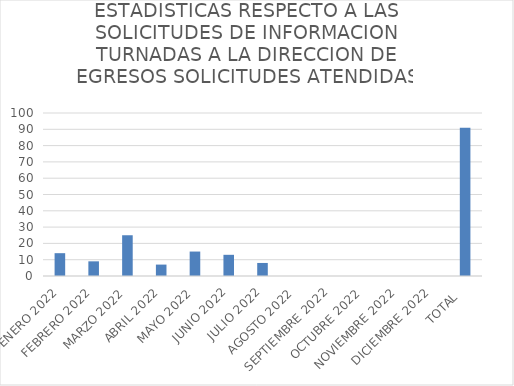
| Category | ESTADISTICAS RESPECTO A LAS SOLICITUDES DE INFORMACION TURNADAS A LA DIRECCION DE EGRESOS |
|---|---|
| ENERO 2022 | 14 |
| FEBRERO 2022 | 9 |
| MARZO 2022 | 25 |
| ABRIL 2022 | 7 |
| MAYO 2022 | 15 |
| JUNIO 2022 | 13 |
| JULIO 2022 | 8 |
| AGOSTO 2022 | 0 |
| SEPTIEMBRE 2022 | 0 |
| OCTUBRE 2022 | 0 |
| NOVIEMBRE 2022 | 0 |
| DICIEMBRE 2022 | 0 |
| TOTAL  | 91 |